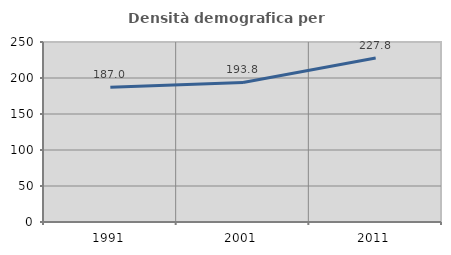
| Category | Densità demografica |
|---|---|
| 1991.0 | 187.007 |
| 2001.0 | 193.76 |
| 2011.0 | 227.754 |